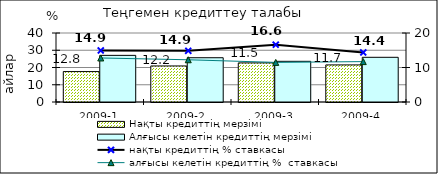
| Category | Нақты кредиттің мерзімі  | Алғысы келетін кредиттің мерзімі  |
|---|---|---|
| 2009-1 | 17.63 | 27.03 |
| 2009-2 | 20.89 | 25.67 |
| 2009-3 | 22.67 | 23.58 |
| 2009-4 | 21.5 | 25.91 |